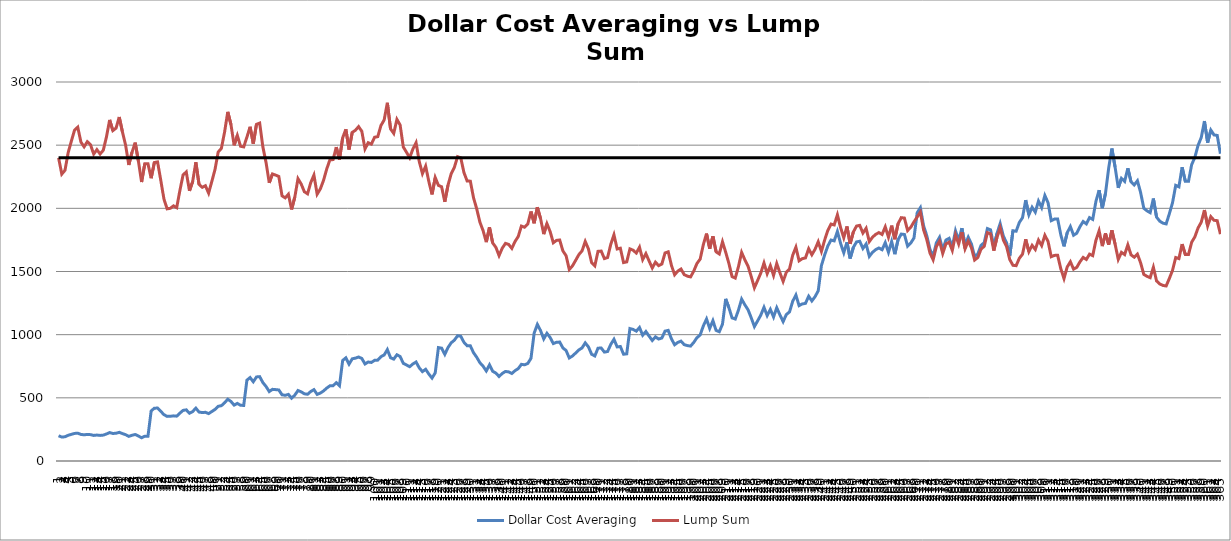
| Category | Dollar Cost Averaging | Lump Sum | Baseline |
|---|---|---|---|
| 0 | 200 | 2400 | 2400 |
| 1 | 189.238 | 2270.86 | 2400 |
| 2 | 191.777 | 2301.318 | 2400 |
| 3 | 203.412 | 2440.944 | 2400 |
| 4 | 211.028 | 2532.334 | 2400 |
| 5 | 218.266 | 2619.19 | 2400 |
| 6 | 220.219 | 2642.628 | 2400 |
| 7 | 210.333 | 2523.997 | 2400 |
| 8 | 207.241 | 2486.888 | 2400 |
| 9 | 210.631 | 2527.573 | 2400 |
| 10 | 208.601 | 2503.212 | 2400 |
| 11 | 202.466 | 2429.598 | 2400 |
| 12 | 205.373 | 2464.47 | 2400 |
| 13 | 202.501 | 2430.014 | 2400 |
| 14 | 205 | 2459.997 | 2400 |
| 15 | 213.839 | 2566.063 | 2400 |
| 16 | 225.006 | 2700.072 | 2400 |
| 17 | 217.944 | 2615.327 | 2400 |
| 18 | 219.551 | 2634.614 | 2400 |
| 19 | 226.901 | 2722.816 | 2400 |
| 20 | 217.076 | 2604.908 | 2400 |
| 21 | 208.303 | 2499.642 | 2400 |
| 22 | 195.26 | 2343.121 | 2400 |
| 23 | 203.638 | 2443.656 | 2400 |
| 24 | 210.009 | 2520.103 | 2400 |
| 25 | 197.824 | 2373.886 | 2400 |
| 26 | 183.992 | 2207.908 | 2400 |
| 27 | 196.031 | 2352.376 | 2400 |
| 28 | 196.072 | 2352.862 | 2400 |
| 29 | 396.072 | 2238.456 | 2400 |
| 30 | 418.037 | 2362.594 | 2400 |
| 31 | 418.92 | 2367.586 | 2400 |
| 32 | 393.567 | 2224.301 | 2400 |
| 33 | 366.973 | 2073.999 | 2400 |
| 34 | 353.18 | 1996.048 | 2400 |
| 35 | 353.915 | 2000.202 | 2400 |
| 36 | 357.355 | 2019.644 | 2400 |
| 37 | 354.823 | 2005.33 | 2400 |
| 38 | 378.764 | 2140.641 | 2400 |
| 39 | 400.714 | 2264.694 | 2400 |
| 40 | 404.844 | 2288.033 | 2400 |
| 41 | 378.324 | 2138.149 | 2400 |
| 42 | 391.278 | 2211.364 | 2400 |
| 43 | 418.44 | 2364.872 | 2400 |
| 44 | 387.442 | 2189.68 | 2400 |
| 45 | 383.327 | 2166.428 | 2400 |
| 46 | 385.531 | 2178.884 | 2400 |
| 47 | 375.195 | 2120.47 | 2400 |
| 48 | 391.406 | 2212.088 | 2400 |
| 49 | 408.211 | 2307.06 | 2400 |
| 50 | 432.759 | 2445.799 | 2400 |
| 51 | 437.797 | 2474.272 | 2400 |
| 52 | 460.573 | 2602.991 | 2400 |
| 53 | 489.016 | 2763.744 | 2400 |
| 54 | 471.203 | 2663.072 | 2400 |
| 55 | 442.16 | 2498.928 | 2400 |
| 56 | 455.903 | 2576.599 | 2400 |
| 57 | 440.857 | 2491.566 | 2400 |
| 58 | 439.906 | 2486.192 | 2400 |
| 59 | 639.906 | 2563.181 | 2400 |
| 60 | 660.478 | 2645.582 | 2400 |
| 61 | 627.139 | 2512.043 | 2400 |
| 62 | 665.478 | 2665.608 | 2400 |
| 63 | 667.767 | 2674.779 | 2400 |
| 64 | 620.735 | 2486.389 | 2400 |
| 65 | 589.688 | 2362.029 | 2400 |
| 66 | 549.617 | 2201.522 | 2400 |
| 67 | 567.227 | 2272.062 | 2400 |
| 68 | 565.005 | 2263.16 | 2400 |
| 69 | 562.29 | 2252.284 | 2400 |
| 70 | 524.043 | 2099.085 | 2400 |
| 71 | 519.978 | 2082.801 | 2400 |
| 72 | 527.214 | 2111.784 | 2400 |
| 73 | 497.126 | 1991.267 | 2400 |
| 74 | 521.242 | 2087.866 | 2400 |
| 75 | 557.886 | 2234.644 | 2400 |
| 76 | 547.436 | 2192.785 | 2400 |
| 77 | 532.104 | 2131.375 | 2400 |
| 78 | 528.005 | 2114.956 | 2400 |
| 79 | 550.175 | 2203.758 | 2400 |
| 80 | 564.922 | 2262.829 | 2400 |
| 81 | 527.214 | 2111.784 | 2400 |
| 82 | 537.579 | 2153.302 | 2400 |
| 83 | 554.439 | 2220.839 | 2400 |
| 84 | 576.915 | 2310.868 | 2400 |
| 85 | 595.096 | 2383.69 | 2400 |
| 86 | 595.635 | 2385.851 | 2400 |
| 87 | 620.216 | 2484.309 | 2400 |
| 88 | 595.727 | 2386.22 | 2400 |
| 89 | 795.727 | 2558.65 | 2400 |
| 90 | 816.49 | 2625.411 | 2400 |
| 91 | 766.765 | 2465.523 | 2400 |
| 92 | 808.981 | 2601.268 | 2400 |
| 93 | 814.205 | 2618.063 | 2400 |
| 94 | 823.157 | 2646.85 | 2400 |
| 95 | 811.537 | 2609.484 | 2400 |
| 96 | 768.171 | 2470.042 | 2400 |
| 97 | 783.52 | 2519.397 | 2400 |
| 98 | 780.084 | 2508.35 | 2400 |
| 99 | 796.988 | 2562.703 | 2400 |
| 100 | 798.471 | 2567.472 | 2400 |
| 101 | 825.951 | 2655.834 | 2400 |
| 102 | 839.482 | 2699.341 | 2400 |
| 103 | 881.87 | 2835.641 | 2400 |
| 104 | 817.616 | 2629.032 | 2400 |
| 105 | 806.447 | 2593.117 | 2400 |
| 106 | 841.015 | 2704.272 | 2400 |
| 107 | 827.292 | 2660.145 | 2400 |
| 108 | 772.924 | 2485.327 | 2400 |
| 109 | 760.002 | 2443.776 | 2400 |
| 110 | 746.439 | 2400.162 | 2400 |
| 111 | 768.068 | 2469.711 | 2400 |
| 112 | 783.548 | 2519.486 | 2400 |
| 113 | 737.05 | 2369.975 | 2400 |
| 114 | 707.465 | 2274.845 | 2400 |
| 115 | 725.871 | 2334.026 | 2400 |
| 116 | 687.967 | 2212.147 | 2400 |
| 117 | 656.262 | 2110.203 | 2400 |
| 118 | 697.725 | 2243.526 | 2400 |
| 119 | 897.725 | 2181.747 | 2400 |
| 120 | 893.197 | 2170.74 | 2400 |
| 121 | 844.11 | 2051.444 | 2400 |
| 122 | 898.382 | 2183.341 | 2400 |
| 123 | 935.424 | 2273.367 | 2400 |
| 124 | 956.683 | 2325.032 | 2400 |
| 125 | 991.195 | 2408.906 | 2400 |
| 126 | 987.438 | 2399.775 | 2400 |
| 127 | 939.35 | 2282.907 | 2400 |
| 128 | 911.987 | 2216.407 | 2400 |
| 129 | 911.425 | 2215.041 | 2400 |
| 130 | 857.366 | 2083.661 | 2400 |
| 131 | 821.138 | 1995.617 | 2400 |
| 132 | 777.875 | 1890.473 | 2400 |
| 133 | 750.249 | 1823.334 | 2400 |
| 134 | 712.868 | 1732.487 | 2400 |
| 135 | 761.378 | 1850.38 | 2400 |
| 136 | 710.241 | 1726.101 | 2400 |
| 137 | 695.977 | 1691.436 | 2400 |
| 138 | 668.903 | 1625.638 | 2400 |
| 139 | 693.221 | 1684.738 | 2400 |
| 140 | 708.808 | 1722.618 | 2400 |
| 141 | 705.359 | 1714.238 | 2400 |
| 142 | 692.498 | 1682.98 | 2400 |
| 143 | 714.924 | 1737.483 | 2400 |
| 144 | 731.111 | 1776.823 | 2400 |
| 145 | 765.171 | 1859.6 | 2400 |
| 146 | 761.372 | 1850.365 | 2400 |
| 147 | 772.169 | 1876.605 | 2400 |
| 148 | 812.612 | 1974.896 | 2400 |
| 149 | 1012.612 | 1881.672 | 2400 |
| 150 | 1081.069 | 2008.879 | 2400 |
| 151 | 1032.51 | 1918.647 | 2400 |
| 152 | 966.412 | 1795.82 | 2400 |
| 153 | 1010.863 | 1878.421 | 2400 |
| 154 | 977.429 | 1816.292 | 2400 |
| 155 | 929.515 | 1727.257 | 2400 |
| 156 | 939.707 | 1746.196 | 2400 |
| 157 | 941.402 | 1749.345 | 2400 |
| 158 | 894.808 | 1662.764 | 2400 |
| 159 | 874.637 | 1625.281 | 2400 |
| 160 | 815.551 | 1515.485 | 2400 |
| 161 | 831.245 | 1544.648 | 2400 |
| 162 | 854.725 | 1588.28 | 2400 |
| 163 | 879.159 | 1633.684 | 2400 |
| 164 | 895.209 | 1663.508 | 2400 |
| 165 | 935.037 | 1737.518 | 2400 |
| 166 | 903.531 | 1678.973 | 2400 |
| 167 | 845.027 | 1570.259 | 2400 |
| 168 | 831.529 | 1545.176 | 2400 |
| 169 | 893.095 | 1659.581 | 2400 |
| 170 | 894.262 | 1661.749 | 2400 |
| 171 | 862.182 | 1602.136 | 2400 |
| 172 | 866.687 | 1610.508 | 2400 |
| 173 | 922.927 | 1715.015 | 2400 |
| 174 | 963.409 | 1790.241 | 2400 |
| 175 | 903.094 | 1678.161 | 2400 |
| 176 | 906.519 | 1684.525 | 2400 |
| 177 | 845.241 | 1570.657 | 2400 |
| 178 | 848.304 | 1576.348 | 2400 |
| 179 | 1048.304 | 1679.026 | 2400 |
| 180 | 1041.712 | 1668.468 | 2400 |
| 181 | 1027.868 | 1646.295 | 2400 |
| 182 | 1056.684 | 1692.449 | 2400 |
| 183 | 995.41 | 1594.308 | 2400 |
| 184 | 1024.801 | 1641.382 | 2400 |
| 185 | 988.769 | 1583.671 | 2400 |
| 186 | 953.813 | 1527.684 | 2400 |
| 187 | 982.631 | 1573.84 | 2400 |
| 188 | 965.513 | 1546.423 | 2400 |
| 189 | 973.273 | 1558.852 | 2400 |
| 190 | 1028.048 | 1646.583 | 2400 |
| 191 | 1033.841 | 1655.861 | 2400 |
| 192 | 967.337 | 1549.345 | 2400 |
| 193 | 920.237 | 1473.907 | 2400 |
| 194 | 938.521 | 1503.191 | 2400 |
| 195 | 948.78 | 1519.623 | 2400 |
| 196 | 921.124 | 1475.328 | 2400 |
| 197 | 913.549 | 1463.194 | 2400 |
| 198 | 909.68 | 1456.997 | 2400 |
| 199 | 938.587 | 1503.297 | 2400 |
| 200 | 976.233 | 1563.593 | 2400 |
| 201 | 997.508 | 1597.668 | 2400 |
| 202 | 1069.349 | 1712.734 | 2400 |
| 203 | 1123.861 | 1800.044 | 2400 |
| 204 | 1049.328 | 1680.666 | 2400 |
| 205 | 1110.94 | 1779.347 | 2400 |
| 206 | 1033.719 | 1655.666 | 2400 |
| 207 | 1023.293 | 1638.967 | 2400 |
| 208 | 1083.255 | 1735.006 | 2400 |
| 209 | 1283.255 | 1653.328 | 2400 |
| 210 | 1214.579 | 1564.847 | 2400 |
| 211 | 1132.912 | 1459.629 | 2400 |
| 212 | 1123.859 | 1447.965 | 2400 |
| 213 | 1193.988 | 1538.317 | 2400 |
| 214 | 1281.323 | 1650.839 | 2400 |
| 215 | 1236.591 | 1593.207 | 2400 |
| 216 | 1197.58 | 1542.945 | 2400 |
| 217 | 1133.753 | 1460.712 | 2400 |
| 218 | 1064.184 | 1371.079 | 2400 |
| 219 | 1108.586 | 1428.287 | 2400 |
| 220 | 1154.778 | 1487.799 | 2400 |
| 221 | 1216.512 | 1567.337 | 2400 |
| 222 | 1151.008 | 1482.943 | 2400 |
| 223 | 1200.004 | 1546.068 | 2400 |
| 224 | 1140.03 | 1468.799 | 2400 |
| 225 | 1213.107 | 1562.95 | 2400 |
| 226 | 1156.205 | 1489.639 | 2400 |
| 227 | 1103.317 | 1421.498 | 2400 |
| 228 | 1159.253 | 1493.566 | 2400 |
| 229 | 1180.122 | 1520.453 | 2400 |
| 230 | 1264.2 | 1628.778 | 2400 |
| 231 | 1313.544 | 1692.352 | 2400 |
| 232 | 1229.987 | 1584.698 | 2400 |
| 233 | 1243.197 | 1601.718 | 2400 |
| 234 | 1247.696 | 1607.515 | 2400 |
| 235 | 1304.152 | 1680.251 | 2400 |
| 236 | 1267.087 | 1632.497 | 2400 |
| 237 | 1300.884 | 1676.041 | 2400 |
| 238 | 1347.139 | 1735.635 | 2400 |
| 239 | 1547.139 | 1659.008 | 2400 |
| 240 | 1630.294 | 1748.176 | 2400 |
| 241 | 1701.753 | 1824.802 | 2400 |
| 242 | 1748.943 | 1875.405 | 2400 |
| 243 | 1742.59 | 1868.592 | 2400 |
| 244 | 1817.173 | 1948.568 | 2400 |
| 245 | 1723.404 | 1848.019 | 2400 |
| 246 | 1647.862 | 1767.014 | 2400 |
| 247 | 1731.661 | 1856.873 | 2400 |
| 248 | 1602.953 | 1718.859 | 2400 |
| 249 | 1690.579 | 1812.82 | 2400 |
| 250 | 1734.505 | 1859.923 | 2400 |
| 251 | 1739.396 | 1865.167 | 2400 |
| 252 | 1682.511 | 1804.169 | 2400 |
| 253 | 1717.766 | 1841.973 | 2400 |
| 254 | 1619.584 | 1736.692 | 2400 |
| 255 | 1651.83 | 1771.27 | 2400 |
| 256 | 1672.971 | 1793.939 | 2400 |
| 257 | 1686.099 | 1808.017 | 2400 |
| 258 | 1672.236 | 1793.151 | 2400 |
| 259 | 1728.486 | 1853.468 | 2400 |
| 260 | 1651.818 | 1771.257 | 2400 |
| 261 | 1737.604 | 1863.245 | 2400 |
| 262 | 1637.066 | 1755.438 | 2400 |
| 263 | 1750.823 | 1877.42 | 2400 |
| 264 | 1796.14 | 1926.014 | 2400 |
| 265 | 1793.246 | 1922.911 | 2400 |
| 266 | 1701.136 | 1824.141 | 2400 |
| 267 | 1725.632 | 1850.408 | 2400 |
| 268 | 1765.584 | 1893.249 | 2400 |
| 269 | 1965.584 | 1931.675 | 2400 |
| 270 | 2005.012 | 1970.423 | 2400 |
| 271 | 1862.731 | 1830.596 | 2400 |
| 272 | 1784.163 | 1753.384 | 2400 |
| 273 | 1675.818 | 1646.908 | 2400 |
| 274 | 1620.578 | 1592.621 | 2400 |
| 275 | 1726.45 | 1696.667 | 2400 |
| 276 | 1770.544 | 1739.999 | 2400 |
| 277 | 1671.753 | 1642.913 | 2400 |
| 278 | 1748.92 | 1718.749 | 2400 |
| 279 | 1762.539 | 1732.133 | 2400 |
| 280 | 1696.395 | 1667.13 | 2400 |
| 281 | 1821.841 | 1790.412 | 2400 |
| 282 | 1747.526 | 1717.379 | 2400 |
| 283 | 1843.419 | 1811.618 | 2400 |
| 284 | 1708.841 | 1679.361 | 2400 |
| 285 | 1771.325 | 1740.768 | 2400 |
| 286 | 1717.428 | 1687.8 | 2400 |
| 287 | 1618.742 | 1590.817 | 2400 |
| 288 | 1639.014 | 1610.739 | 2400 |
| 289 | 1706.709 | 1677.266 | 2400 |
| 290 | 1728.904 | 1699.079 | 2400 |
| 291 | 1839.603 | 1807.867 | 2400 |
| 292 | 1829.548 | 1797.986 | 2400 |
| 293 | 1694.212 | 1664.985 | 2400 |
| 294 | 1800.644 | 1769.581 | 2400 |
| 295 | 1879.353 | 1846.932 | 2400 |
| 296 | 1780.018 | 1749.31 | 2400 |
| 297 | 1728.113 | 1698.301 | 2400 |
| 298 | 1622.58 | 1594.589 | 2400 |
| 299 | 1822.58 | 1549.179 | 2400 |
| 300 | 1819.063 | 1546.19 | 2400 |
| 301 | 1887.801 | 1604.617 | 2400 |
| 302 | 1926.346 | 1637.379 | 2400 |
| 303 | 2064.916 | 1755.163 | 2400 |
| 304 | 1949.271 | 1656.865 | 2400 |
| 305 | 2008.397 | 1707.122 | 2400 |
| 306 | 1969.851 | 1674.358 | 2400 |
| 307 | 2057.221 | 1748.622 | 2400 |
| 308 | 2005.964 | 1705.054 | 2400 |
| 309 | 2101.547 | 1786.299 | 2400 |
| 310 | 2044.493 | 1737.804 | 2400 |
| 311 | 1902.465 | 1617.08 | 2400 |
| 312 | 1914.719 | 1627.496 | 2400 |
| 313 | 1915.905 | 1628.505 | 2400 |
| 314 | 1789.756 | 1521.278 | 2400 |
| 315 | 1698.916 | 1444.066 | 2400 |
| 316 | 1806.843 | 1535.803 | 2400 |
| 317 | 1855.298 | 1576.989 | 2400 |
| 318 | 1786.977 | 1518.916 | 2400 |
| 319 | 1803.439 | 1532.909 | 2400 |
| 320 | 1854.956 | 1576.698 | 2400 |
| 321 | 1895.858 | 1611.464 | 2400 |
| 322 | 1876.844 | 1595.303 | 2400 |
| 323 | 1926.504 | 1637.513 | 2400 |
| 324 | 1912.46 | 1625.576 | 2400 |
| 325 | 2055.197 | 1746.901 | 2400 |
| 326 | 2143.949 | 1822.34 | 2400 |
| 327 | 2001.168 | 1700.978 | 2400 |
| 328 | 2119.51 | 1801.567 | 2400 |
| 329 | 2319.51 | 1712.304 | 2400 |
| 330 | 2473.489 | 1825.974 | 2400 |
| 331 | 2326.586 | 1717.528 | 2400 |
| 332 | 2161.894 | 1595.949 | 2400 |
| 333 | 2237.264 | 1651.589 | 2400 |
| 334 | 2213.354 | 1633.938 | 2400 |
| 335 | 2317.593 | 1710.889 | 2400 |
| 336 | 2210.248 | 1631.645 | 2400 |
| 337 | 2185.318 | 1613.241 | 2400 |
| 338 | 2217.971 | 1637.346 | 2400 |
| 339 | 2125.43 | 1569.031 | 2400 |
| 340 | 2000.627 | 1476.899 | 2400 |
| 341 | 1980.201 | 1461.82 | 2400 |
| 342 | 1965.762 | 1451.161 | 2400 |
| 343 | 2077.441 | 1533.604 | 2400 |
| 344 | 1930.486 | 1425.12 | 2400 |
| 345 | 1898.373 | 1401.413 | 2400 |
| 346 | 1882.685 | 1389.832 | 2400 |
| 347 | 1876.741 | 1385.444 | 2400 |
| 348 | 1956.771 | 1444.524 | 2400 |
| 349 | 2044.314 | 1509.15 | 2400 |
| 350 | 2181.86 | 1610.688 | 2400 |
| 351 | 2170.341 | 1602.185 | 2400 |
| 352 | 2325.771 | 1716.926 | 2400 |
| 353 | 2214.823 | 1635.022 | 2400 |
| 354 | 2213.628 | 1634.14 | 2400 |
| 355 | 2346.029 | 1731.881 | 2400 |
| 356 | 2403.817 | 1774.541 | 2400 |
| 357 | 2498.65 | 1844.548 | 2400 |
| 358 | 2560.326 | 1890.079 | 2400 |
| 359 | 2690.809 | 1986.404 | 2400 |
| 360 | 2519.722 | 1860.104 | 2400 |
| 361 | 2619.572 | 1933.815 | 2400 |
| 362 | 2581.003 | 1905.343 | 2400 |
| 363 | 2576.995 | 1902.384 | 2400 |
| 364 | 2432.383 | 1795.629 | 2400 |